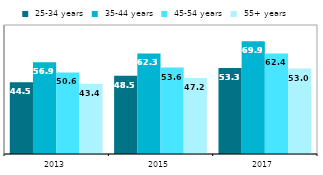
| Category |  25-34 years |  35-44 years |  45-54 years |  55+ years |
|---|---|---|---|---|
| 2013.0 | 44.548 | 56.915 | 50.591 | 43.44 |
| 2015.0 | 48.513 | 62.326 | 53.637 | 47.162 |
| 2017.0 | 53.341 | 69.853 | 62.38 | 53.017 |